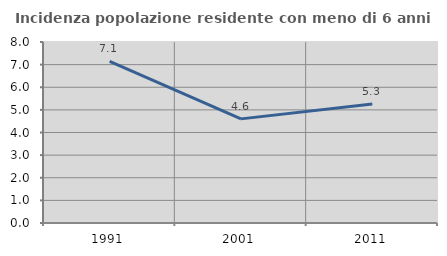
| Category | Incidenza popolazione residente con meno di 6 anni |
|---|---|
| 1991.0 | 7.143 |
| 2001.0 | 4.603 |
| 2011.0 | 5.263 |